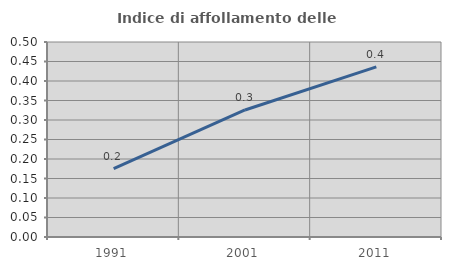
| Category | Indice di affollamento delle abitazioni  |
|---|---|
| 1991.0 | 0.175 |
| 2001.0 | 0.326 |
| 2011.0 | 0.436 |